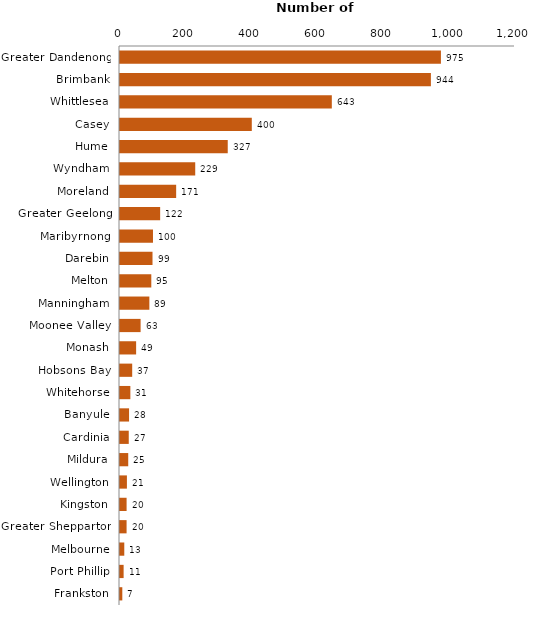
| Category | Municipality |
|---|---|
| Greater Dandenong | 974.953 |
| Brimbank | 944.493 |
| Whittlesea | 643.496 |
| Casey | 400.391 |
| Hume | 327.327 |
| Wyndham | 228.546 |
| Moreland | 170.603 |
| Greater Geelong | 122 |
| Maribyrnong | 100.212 |
| Darebin | 98.774 |
| Melton | 95.085 |
| Manningham | 89.183 |
| Moonee Valley | 62.606 |
| Monash | 49 |
| Hobsons Bay | 37.058 |
| Whitehorse | 31.46 |
| Banyule | 27.544 |
| Cardinia | 26.602 |
| Mildura | 25 |
| Wellington | 21 |
| Kingston | 20.047 |
| Greater Shepparton | 20 |
| Melbourne | 13 |
| Port Phillip | 11 |
| Frankston | 7.007 |